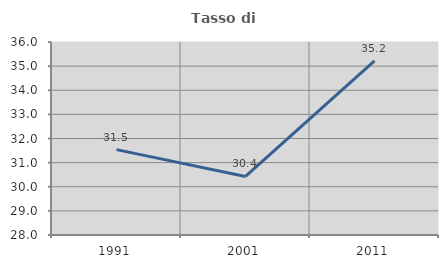
| Category | Tasso di occupazione   |
|---|---|
| 1991.0 | 31.538 |
| 2001.0 | 30.426 |
| 2011.0 | 35.22 |